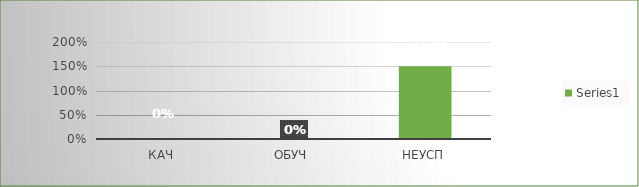
| Category | Series 0 |
|---|---|
| кач | 0 |
| обуч | 0 |
| неусп | 1.5 |